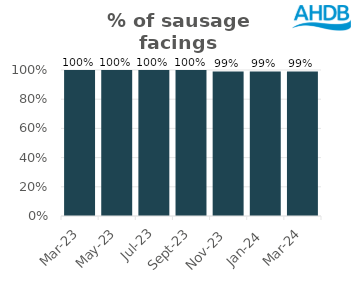
| Category | Sausage |
|---|---|
| 2023-03-01 | 1 |
| 2023-05-01 | 1 |
| 2023-07-01 | 1 |
| 2023-09-01 | 1 |
| 2023-11-01 | 0.99 |
| 2024-01-01 | 0.99 |
| 2024-03-01 | 0.99 |